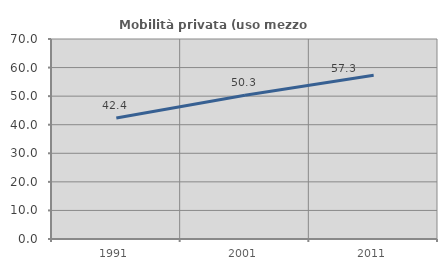
| Category | Mobilità privata (uso mezzo privato) |
|---|---|
| 1991.0 | 42.379 |
| 2001.0 | 50.338 |
| 2011.0 | 57.326 |